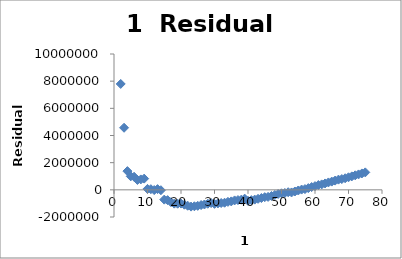
| Category | Series 0 |
|---|---|
| 2.0 | 7795283.697 |
| 3.0 | 4569918.413 |
| 4.0 | 1378119.13 |
| 5.0 | 994402.846 |
| 6.0 | 961893.562 |
| 7.0 | 726341.278 |
| 8.0 | 765672.994 |
| 9.0 | 825336.711 |
| 10.0 | 67883.427 |
| 11.0 | 47954.143 |
| 12.0 | -17438.141 |
| 13.0 | 53012.575 |
| 14.0 | -27828.709 |
| 15.0 | -721067.992 |
| 16.0 | -758184.276 |
| 17.0 | -909171.56 |
| 18.0 | -1015714.844 |
| 19.0 | -1020845.128 |
| 20.0 | -1009670.411 |
| 21.0 | -1092342.695 |
| 22.0 | -1169957.979 |
| 23.0 | -1235869.263 |
| 24.0 | -1210375.547 |
| 25.0 | -1177861.831 |
| 26.0 | -1121584.114 |
| 27.0 | -1077482.398 |
| 28.0 | -1022792.682 |
| 29.0 | -974371.966 |
| 30.0 | -1032854.25 |
| 31.0 | -1001583.534 |
| 32.0 | -969842.817 |
| 33.0 | -949685.101 |
| 34.0 | -885526.385 |
| 35.0 | -851214.669 |
| 36.0 | -779085.953 |
| 37.0 | -753258.236 |
| 38.0 | -725317.52 |
| 39.0 | -648923.804 |
| 40.0 | -807185.088 |
| 41.0 | -756862.372 |
| 42.0 | -720079.656 |
| 43.0 | -661330.939 |
| 44.0 | -602996.223 |
| 45.0 | -540807.507 |
| 46.0 | -519471.791 |
| 47.0 | -451373.075 |
| 48.0 | -380255.358 |
| 49.0 | -304352.642 |
| 50.0 | -253460.926 |
| 51.0 | -230317.21 |
| 52.0 | -174570.494 |
| 53.0 | -192690.778 |
| 54.0 | -121798.061 |
| 55.0 | -48098.345 |
| 56.0 | 19716.371 |
| 57.0 | 56424.087 |
| 58.0 | 126424.803 |
| 59.0 | 204055.52 |
| 60.0 | 273886.236 |
| 61.0 | 350323.952 |
| 62.0 | 399808.668 |
| 63.0 | 469875.384 |
| 64.0 | 544976.1 |
| 65.0 | 606406.817 |
| 66.0 | 679615.533 |
| 67.0 | 750729.249 |
| 68.0 | 793179.965 |
| 69.0 | 852359.681 |
| 70.0 | 924662.397 |
| 71.0 | 991323.114 |
| 72.0 | 1068282.83 |
| 73.0 | 1134785.546 |
| 74.0 | 1208080.262 |
| 75.0 | 1284766.978 |